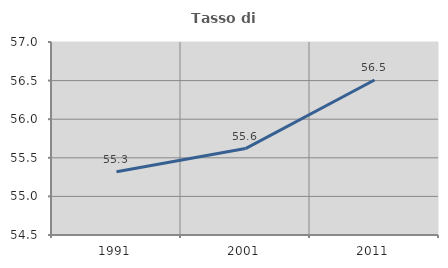
| Category | Tasso di occupazione   |
|---|---|
| 1991.0 | 55.321 |
| 2001.0 | 55.619 |
| 2011.0 | 56.508 |